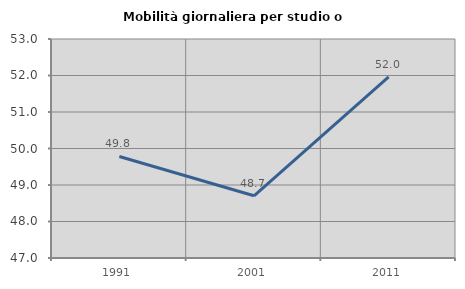
| Category | Mobilità giornaliera per studio o lavoro |
|---|---|
| 1991.0 | 49.782 |
| 2001.0 | 48.704 |
| 2011.0 | 51.961 |